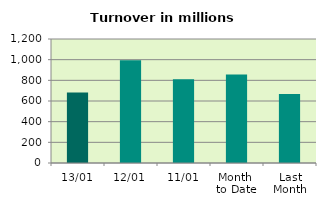
| Category | Series 0 |
|---|---|
| 13/01 | 682.678 |
| 12/01 | 993.513 |
| 11/01 | 811.333 |
| Month 
to Date | 856.252 |
| Last
Month | 667.375 |